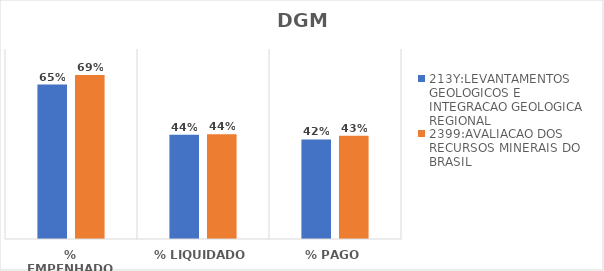
| Category | 213Y:LEVANTAMENTOS GEOLOGICOS E INTEGRACAO GEOLOGICA REGIONAL | 2399:AVALIACAO DOS RECURSOS MINERAIS DO BRASIL |
|---|---|---|
| % EMPENHADO | 0.65 | 0.69 |
| % LIQUIDADO | 0.439 | 0.441 |
| % PAGO | 0.419 | 0.435 |